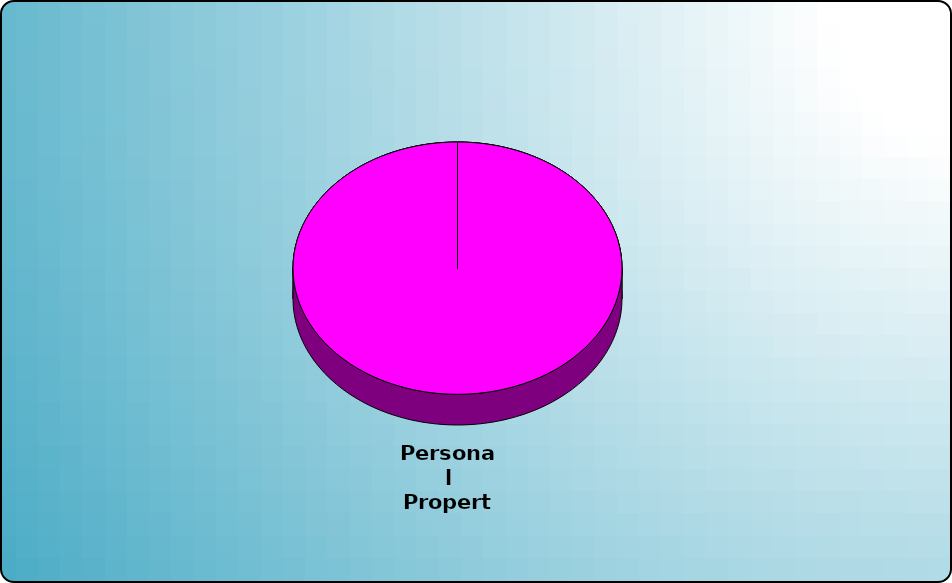
| Category | Series 0 |
|---|---|
| Cash | 0 |
| Bonds | 0 |
| Muni Bond | 0 |
| Hybrid bond | 0 |
| Value | 0 |
| Growth | 0 |
| Small-Cap | 0 |
| Tangibles | 0 |
| International | 0 |
| Personal Property | 525000 |
| Miscellaneous | 0 |